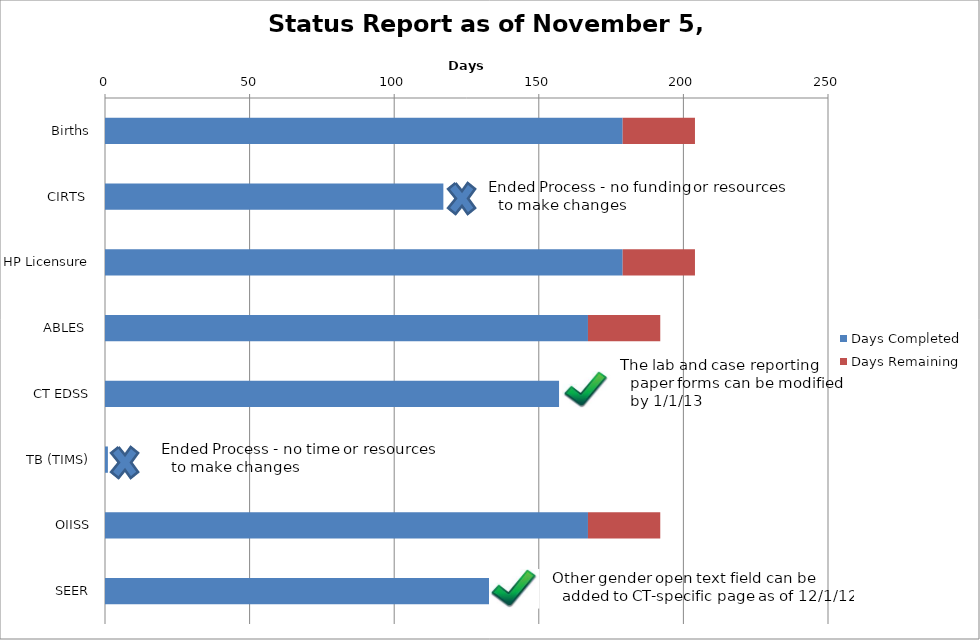
| Category | Days Completed | Days Remaining |
|---|---|---|
| Births | 179 | 25 |
| CIRTS  | 117 | 0 |
| HP Licensure | 179 | 25 |
| ABLES  | 167 | 25 |
| CT EDSS | 157 | 0 |
| TB (TIMS) | 1 | 0 |
| OIISS | 167 | 25 |
| SEER | 133 | 0 |